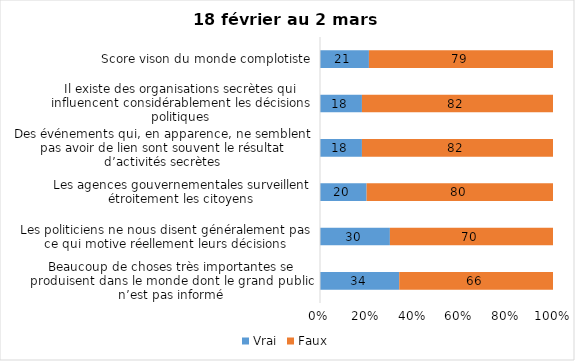
| Category | Vrai | Faux |
|---|---|---|
| Beaucoup de choses très importantes se produisent dans le monde dont le grand public n’est pas informé | 34 | 66 |
| Les politiciens ne nous disent généralement pas ce qui motive réellement leurs décisions | 30 | 70 |
| Les agences gouvernementales surveillent étroitement les citoyens | 20 | 80 |
| Des événements qui, en apparence, ne semblent pas avoir de lien sont souvent le résultat d’activités secrètes | 18 | 82 |
| Il existe des organisations secrètes qui influencent considérablement les décisions politiques | 18 | 82 |
| Score vison du monde complotiste | 21 | 79 |